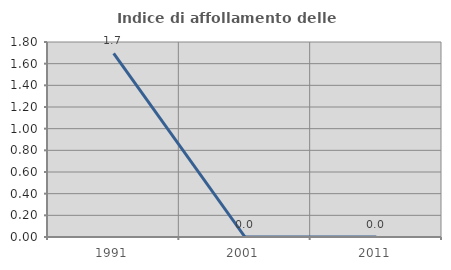
| Category | Indice di affollamento delle abitazioni  |
|---|---|
| 1991.0 | 1.695 |
| 2001.0 | 0 |
| 2011.0 | 0 |